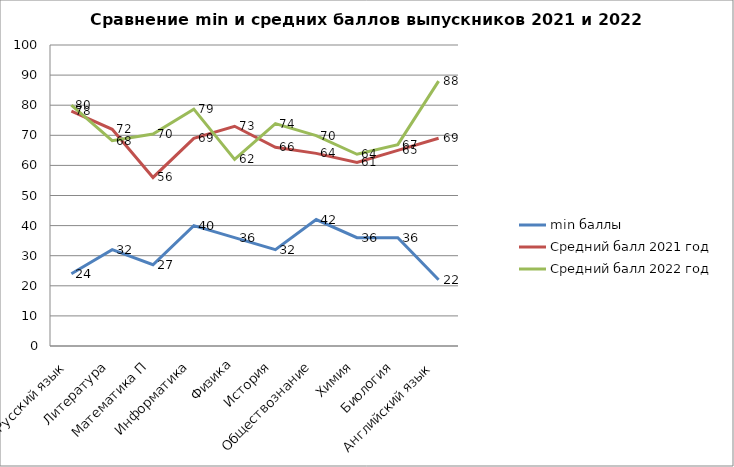
| Category | min баллы | Средний балл 2021 год | Средний балл 2022 год |
|---|---|---|---|
| Русский язык | 24 | 78 | 80 |
| Литература | 32 | 72 | 68.2 |
| Математика П | 27 | 56 | 70.4 |
| Информатика | 40 | 69 | 78.7 |
| Физика | 36 | 73 | 62 |
| История | 32 | 66 | 73.9 |
| Обществознание | 42 | 64 | 69.9 |
| Химия | 36 | 61 | 63.7 |
| Биология | 36 | 65 | 66.9 |
| Английский язык | 22 | 69 | 88 |